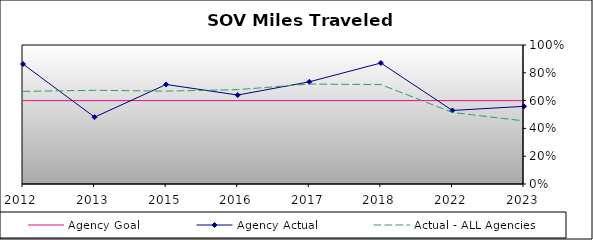
| Category | Agency Goal | Agency Actual | Actual - ALL Agencies |
|---|---|---|---|
| 2012.0 | 0.6 | 0.863 | 0.666 |
| 2013.0 | 0.6 | 0.481 | 0.674 |
| 2015.0 | 0.6 | 0.716 | 0.668 |
| 2016.0 | 0.6 | 0.64 | 0.679 |
| 2017.0 | 0.6 | 0.735 | 0.719 |
| 2018.0 | 0.6 | 0.87 | 0.715 |
| 2022.0 | 0.6 | 0.529 | 0.515 |
| 2023.0 | 0.6 | 0.559 | 0.454 |